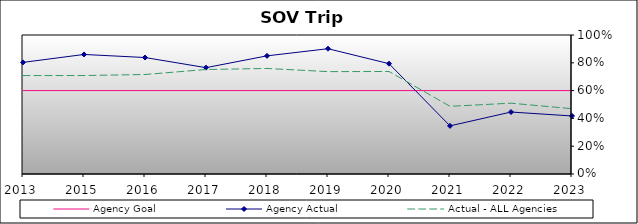
| Category | Agency Goal | Agency Actual | Actual - ALL Agencies |
|---|---|---|---|
| 2013.0 | 0.6 | 0.803 | 0.708 |
| 2015.0 | 0.6 | 0.86 | 0.708 |
| 2016.0 | 0.6 | 0.838 | 0.716 |
| 2017.0 | 0.6 | 0.765 | 0.752 |
| 2018.0 | 0.6 | 0.85 | 0.759 |
| 2019.0 | 0.6 | 0.901 | 0.736 |
| 2020.0 | 0.6 | 0.794 | 0.737 |
| 2021.0 | 0.6 | 0.346 | 0.487 |
| 2022.0 | 0.6 | 0.446 | 0.509 |
| 2023.0 | 0.6 | 0.417 | 0.47 |